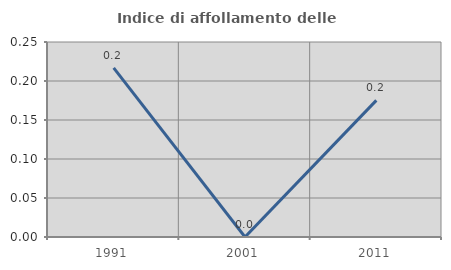
| Category | Indice di affollamento delle abitazioni  |
|---|---|
| 1991.0 | 0.217 |
| 2001.0 | 0 |
| 2011.0 | 0.175 |